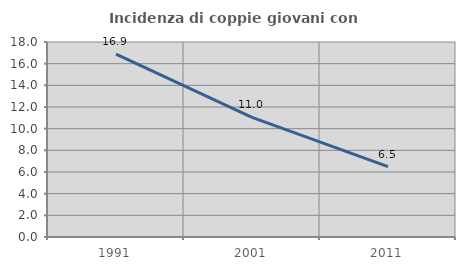
| Category | Incidenza di coppie giovani con figli |
|---|---|
| 1991.0 | 16.888 |
| 2001.0 | 11.043 |
| 2011.0 | 6.491 |